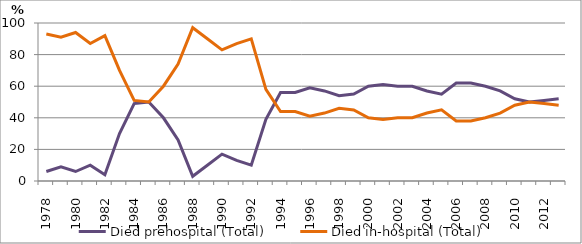
| Category | Died prehospital (Total) | Died in-hospital (Total) |
|---|---|---|
| 1978.0 | 6 | 93 |
| 1979.0 | 9 | 91 |
| 1980.0 | 6 | 94 |
| 1981.0 | 10 | 87 |
| 1982.0 | 4 | 92 |
| 1983.0 | 30 | 70 |
| 1984.0 | 49 | 51 |
| 1985.0 | 50 | 50 |
| 1986.0 | 40 | 60 |
| 1987.0 | 26 | 74 |
| 1988.0 | 3 | 97 |
| 1989.0 | 10 | 90 |
| 1990.0 | 17 | 83 |
| 1991.0 | 13 | 87 |
| 1992.0 | 10 | 90 |
| 1993.0 | 39 | 58 |
| 1994.0 | 56 | 44 |
| 1995.0 | 56 | 44 |
| 1996.0 | 59 | 41 |
| 1997.0 | 57 | 43 |
| 1998.0 | 54 | 46 |
| 1999.0 | 55 | 45 |
| 2000.0 | 60 | 40 |
| 2001.0 | 61 | 39 |
| 2002.0 | 60 | 40 |
| 2003.0 | 60 | 40 |
| 2004.0 | 57 | 43 |
| 2005.0 | 55 | 45 |
| 2006.0 | 62 | 38 |
| 2007.0 | 62 | 38 |
| 2008.0 | 60 | 40 |
| 2009.0 | 57 | 43 |
| 2010.0 | 52 | 48 |
| 2011.0 | 50 | 50 |
| 2012.0 | 51 | 49 |
| 2013.0 | 52 | 48 |